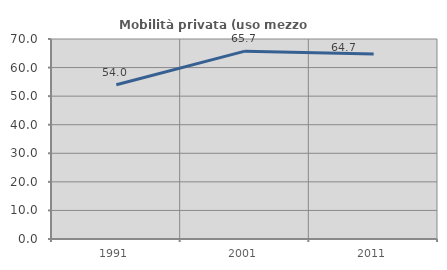
| Category | Mobilità privata (uso mezzo privato) |
|---|---|
| 1991.0 | 53.964 |
| 2001.0 | 65.745 |
| 2011.0 | 64.746 |